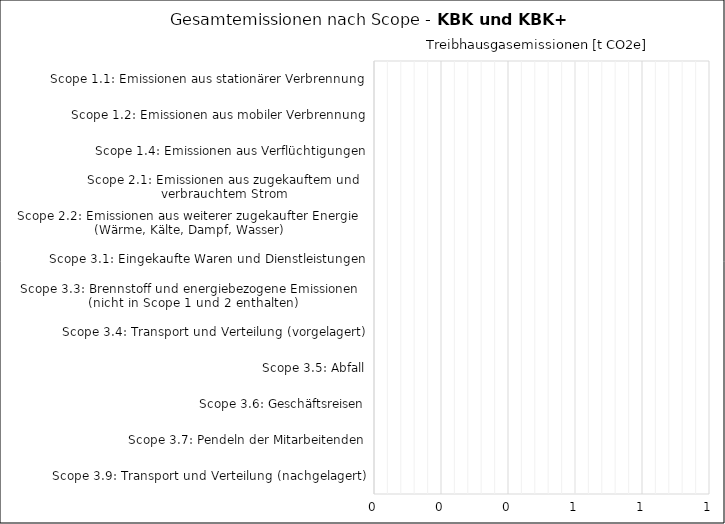
| Category | Series 1 |
|---|---|
| Scope 1.1: Emissionen aus stationärer Verbrennung | 0 |
| Scope 1.2: Emissionen aus mobiler Verbrennung | 0 |
| Scope 1.4: Emissionen aus Verflüchtigungen | 0 |
| Scope 2.1: Emissionen aus zugekauftem und 
verbrauchtem Strom | 0 |
| Scope 2.2: Emissionen aus weiterer zugekaufter Energie 
(Wärme, Kälte, Dampf, Wasser) | 0 |
| Scope 3.1: Eingekaufte Waren und Dienstleistungen | 0 |
| Scope 3.3: Brennstoff und energiebezogene Emissionen 
(nicht in Scope 1 und 2 enthalten) | 0 |
| Scope 3.4: Transport und Verteilung (vorgelagert) | 0 |
| Scope 3.5: Abfall | 0 |
| Scope 3.6: Geschäftsreisen | 0 |
| Scope 3.7: Pendeln der Mitarbeitenden | 0 |
| Scope 3.9: Transport und Verteilung (nachgelagert) | 0 |